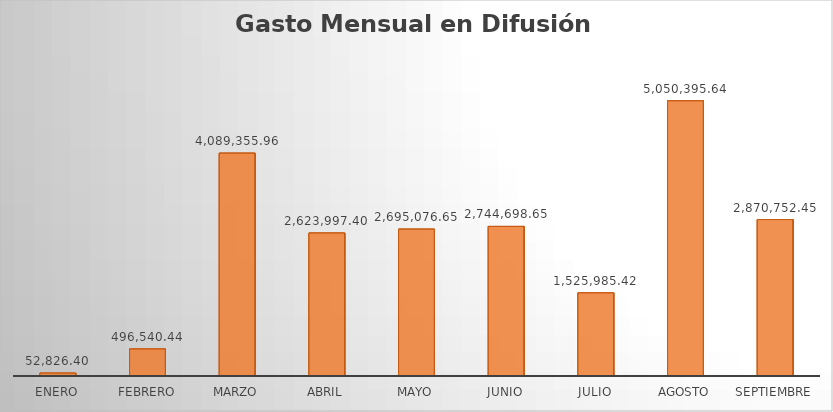
| Category | Monto |
|---|---|
| ENERO | 52826.4 |
| FEBRERO | 496540.44 |
| MARZO | 4089355.96 |
| ABRIL | 2623997.4 |
| MAYO | 2695076.65 |
| JUNIO | 2744698.65 |
| JULIO | 1525985.42 |
| AGOSTO | 5050395.64 |
| SEPTIEMBRE | 2870752.45 |